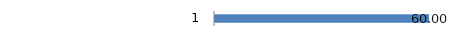
| Category | Percentuale |
|---|---|
| 0 | 60 |